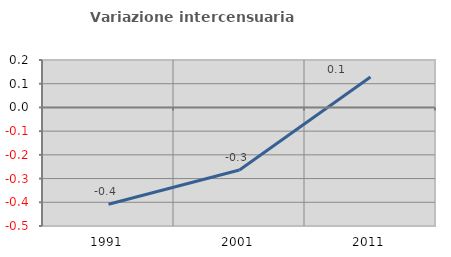
| Category | Variazione intercensuaria annua |
|---|---|
| 1991.0 | -0.408 |
| 2001.0 | -0.264 |
| 2011.0 | 0.128 |